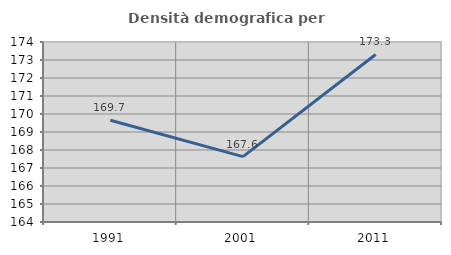
| Category | Densità demografica |
|---|---|
| 1991.0 | 169.654 |
| 2001.0 | 167.632 |
| 2011.0 | 173.309 |